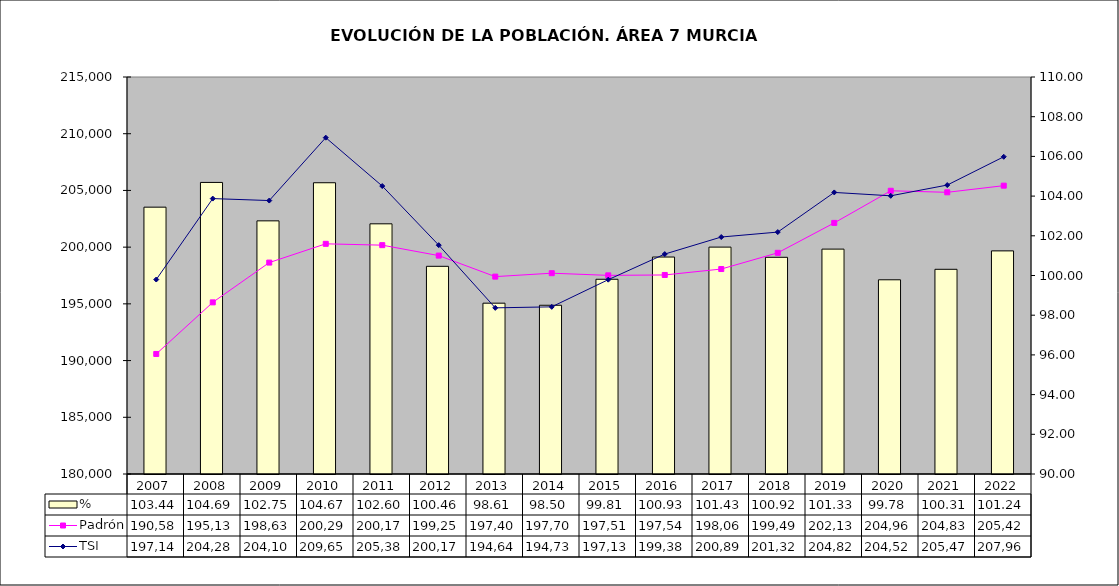
| Category | % |
|---|---|
| 2007.0 | 103.443 |
| 2008.0 | 104.689 |
| 2009.0 | 102.753 |
| 2010.0 | 104.673 |
| 2011.0 | 102.603 |
| 2012.0 | 100.462 |
| 2013.0 | 98.605 |
| 2014.0 | 98.5 |
| 2015.0 | 99.81 |
| 2016.0 | 100.93 |
| 2017.0 | 101.43 |
| 2018.0 | 100.917 |
| 2019.0 | 101.329 |
| 2020.0 | 99.784 |
| 2021.0 | 100.312 |
| 2022.0 | 101.24 |